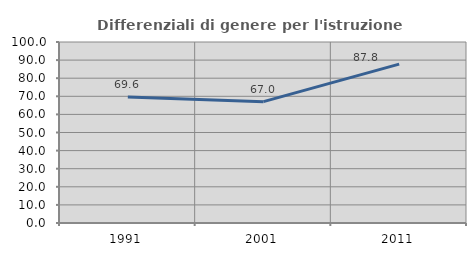
| Category | Differenziali di genere per l'istruzione superiore |
|---|---|
| 1991.0 | 69.646 |
| 2001.0 | 67.039 |
| 2011.0 | 87.782 |